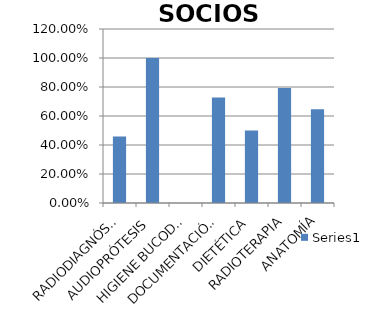
| Category | Series 0 |
|---|---|
| RADIODIAGNÓSTICO | 0.459 |
| AUDIOPRÓTESIS | 1 |
| HIGIENE BUCODENTAL | 0 |
| DOCUMENTACIÓN | 0.727 |
| DIETÉTICA | 0.5 |
| RADIOTERAPIA | 0.793 |
| ANATOMÍA | 0.647 |